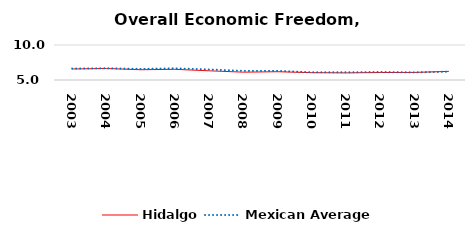
| Category | Hidalgo | Mexican Average  |
|---|---|---|
| 2003.0 | 6.573 | 6.632 |
| 2004.0 | 6.643 | 6.678 |
| 2005.0 | 6.468 | 6.582 |
| 2006.0 | 6.526 | 6.668 |
| 2007.0 | 6.313 | 6.508 |
| 2008.0 | 6.119 | 6.3 |
| 2009.0 | 6.181 | 6.3 |
| 2010.0 | 6.047 | 6.105 |
| 2011.0 | 6.016 | 6.103 |
| 2012.0 | 6.068 | 6.144 |
| 2013.0 | 6.084 | 6.087 |
| 2014.0 | 6.233 | 6.195 |